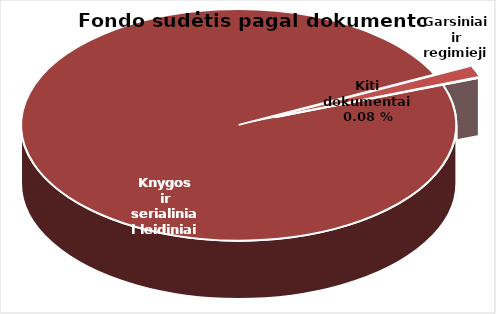
| Category | Series 0 |
|---|---|
| Knygos ir serialiniai | 1818558 |
| Garsiniai ir regimieji | 28147 |
| Kiti dokumentai | 1424 |